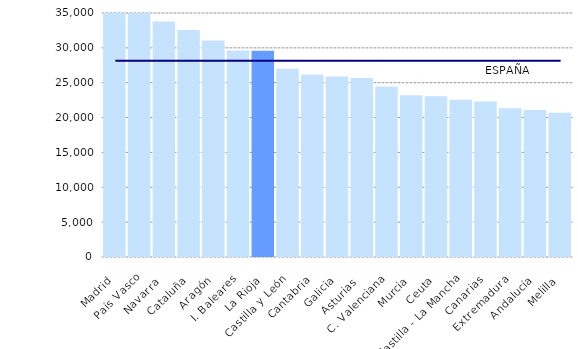
| Category | Series 1 |
|---|---|
| Madrid | 38435 |
| País Vasco | 35832 |
| Navarra  | 33798 |
| Cataluña | 32550 |
| Aragón | 31051 |
| I. Baleares | 29603 |
| La Rioja | 29579 |
| Castilla y León | 26992 |
| Cantabria | 26167 |
| Galicia | 25906 |
| Asturias  | 25675 |
| C. Valenciana | 24473 |
| Murcia | 23197 |
| Ceuta | 23073 |
| Castilla - La Mancha | 22574 |
| Canarias | 22303 |
| Extremadura | 21343 |
| Andalucía | 21091 |
| Melilla | 20698 |